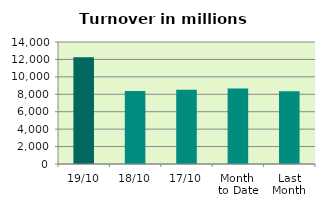
| Category | Series 0 |
|---|---|
| 19/10 | 12260.742 |
| 18/10 | 8364.222 |
| 17/10 | 8517.934 |
| Month 
to Date | 8657.618 |
| Last
Month | 8346.546 |